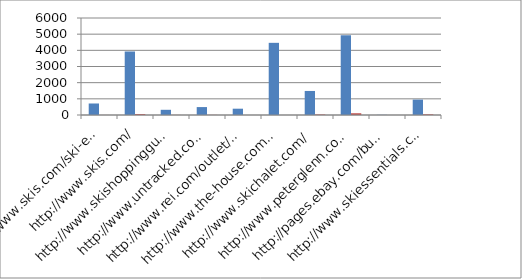
| Category | Followed Links | Nofollowed Links |
|---|---|---|
| http://www.skis.com/ski-equipment/c9/ | 712 | 2 |
| http://www.skis.com/ | 3929 | 56 |
| http://www.skishoppingguide.com/ | 322 | 4 |
| http://www.untracked.com/ | 490 | 8 |
| http://www.rei.com/outlet/category/22000078 | 390 | 0 |
| http://www.the-house.com/skis.html | 4464 | 0 |
| http://www.skichalet.com/ | 1487 | 31 |
| http://www.peterglenn.com/ | 4932 | 108 |
| http://pages.ebay.com/buy/guides/skis-skiing-equipment-buying-guide/ | 10 | 1 |
| http://www.skiessentials.com/ | 953 | 41 |